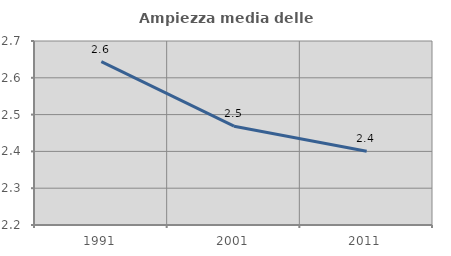
| Category | Ampiezza media delle famiglie |
|---|---|
| 1991.0 | 2.644 |
| 2001.0 | 2.469 |
| 2011.0 | 2.4 |